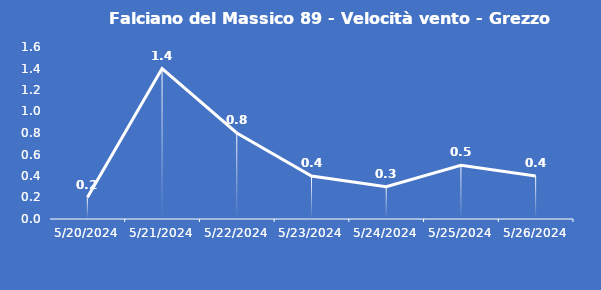
| Category | Falciano del Massico 89 - Velocità vento - Grezzo (m/s) |
|---|---|
| 5/20/24 | 0.2 |
| 5/21/24 | 1.4 |
| 5/22/24 | 0.8 |
| 5/23/24 | 0.4 |
| 5/24/24 | 0.3 |
| 5/25/24 | 0.5 |
| 5/26/24 | 0.4 |